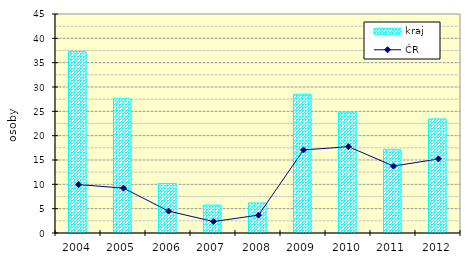
| Category | kraj |
|---|---|
| 2004.0 | 37.297 |
| 2005.0 | 27.579 |
| 2006.0 | 10.18 |
| 2007.0 | 5.741 |
| 2008.0 | 6.162 |
| 2009.0 | 28.503 |
| 2010.0 | 24.838 |
| 2011.0 | 17.119 |
| 2012.0 | 23.442 |